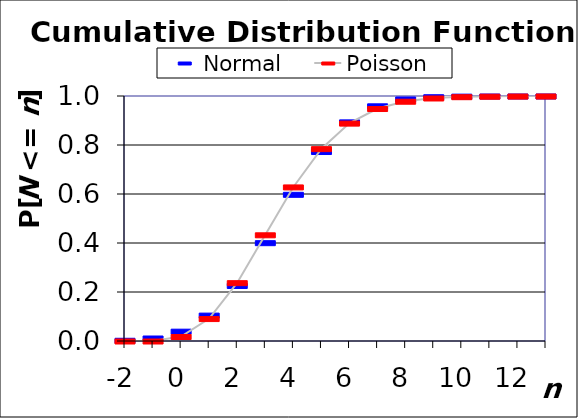
| Category | Normal | Poisson |
|---|---|---|
| -2.0 | 0.003 | 0 |
| -1.0 | 0.012 | 0 |
| 0.0 | 0.04 | 0.018 |
| 1.0 | 0.106 | 0.092 |
| 2.0 | 0.227 | 0.238 |
| 3.0 | 0.401 | 0.433 |
| 4.0 | 0.599 | 0.629 |
| 5.0 | 0.773 | 0.785 |
| 6.0 | 0.894 | 0.889 |
| 7.0 | 0.96 | 0.949 |
| 8.0 | 0.988 | 0.979 |
| 9.0 | 0.997 | 0.992 |
| 10.0 | 0.999 | 0.997 |
| 11.0 | 1 | 0.999 |
| 12.0 | 1 | 1 |
| 13.0 | 1 | 1 |